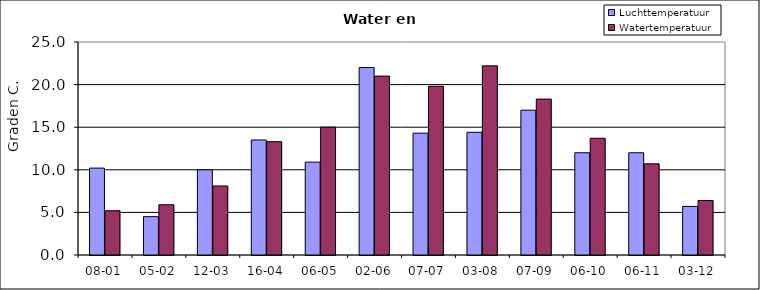
| Category | Luchttemperatuur | Watertemperatuur |
|---|---|---|
| 08-01 | 10.2 | 5.2 |
| 05-02 | 4.5 | 5.9 |
| 12-03 | 10 | 8.1 |
| 16-04 | 13.5 | 13.3 |
| 06-05 | 10.9 | 15 |
| 02-06 | 22 | 21 |
| 07-07 | 14.3 | 19.8 |
| 03-08 | 14.4 | 22.2 |
| 07-09 | 17 | 18.3 |
| 06-10 | 12 | 13.7 |
| 06-11 | 12 | 10.7 |
| 03-12 | 5.7 | 6.4 |